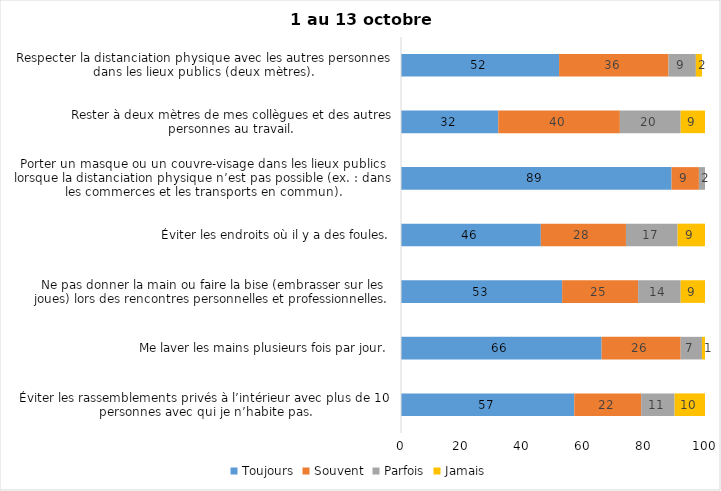
| Category | Toujours | Souvent | Parfois | Jamais |
|---|---|---|---|---|
| Éviter les rassemblements privés à l’intérieur avec plus de 10 personnes avec qui je n’habite pas. | 57 | 22 | 11 | 10 |
| Me laver les mains plusieurs fois par jour. | 66 | 26 | 7 | 1 |
| Ne pas donner la main ou faire la bise (embrasser sur les joues) lors des rencontres personnelles et professionnelles. | 53 | 25 | 14 | 9 |
| Éviter les endroits où il y a des foules. | 46 | 28 | 17 | 9 |
| Porter un masque ou un couvre-visage dans les lieux publics lorsque la distanciation physique n’est pas possible (ex. : dans les commerces et les transports en commun). | 89 | 9 | 2 | 0 |
| Rester à deux mètres de mes collègues et des autres personnes au travail. | 32 | 40 | 20 | 9 |
| Respecter la distanciation physique avec les autres personnes dans les lieux publics (deux mètres). | 52 | 36 | 9 | 2 |